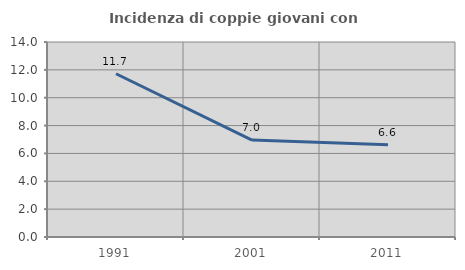
| Category | Incidenza di coppie giovani con figli |
|---|---|
| 1991.0 | 11.721 |
| 2001.0 | 6.961 |
| 2011.0 | 6.625 |